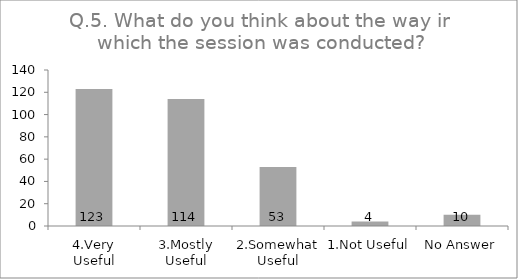
| Category | Q.5. What do you think about the way in which the session was conducted? |
|---|---|
| 4.Very Useful | 123 |
| 3.Mostly Useful | 114 |
| 2.Somewhat Useful | 53 |
| 1.Not Useful | 4 |
| No Answer | 10 |